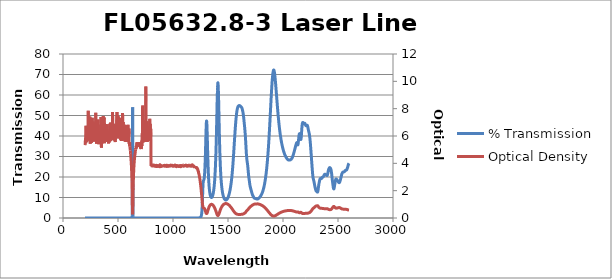
| Category | % Transmission |
|---|---|
| 2600.0 | 26.689 |
| 2599.0 | 26.612 |
| 2598.0 | 26.524 |
| 2597.0 | 26.418 |
| 2596.0 | 26.304 |
| 2595.0 | 26.165 |
| 2594.0 | 25.991 |
| 2593.0 | 25.808 |
| 2592.0 | 25.629 |
| 2591.0 | 25.441 |
| 2590.0 | 25.235 |
| 2589.0 | 25.05 |
| 2588.0 | 24.855 |
| 2587.0 | 24.661 |
| 2586.0 | 24.477 |
| 2585.0 | 24.311 |
| 2584.0 | 24.159 |
| 2583.0 | 23.998 |
| 2582.0 | 23.843 |
| 2581.0 | 23.726 |
| 2580.0 | 23.617 |
| 2579.0 | 23.527 |
| 2578.0 | 23.459 |
| 2577.0 | 23.416 |
| 2576.0 | 23.38 |
| 2575.0 | 23.348 |
| 2574.0 | 23.296 |
| 2573.0 | 23.271 |
| 2572.0 | 23.255 |
| 2571.0 | 23.254 |
| 2570.0 | 23.259 |
| 2569.0 | 23.235 |
| 2568.0 | 23.223 |
| 2567.0 | 23.191 |
| 2566.0 | 23.17 |
| 2565.0 | 23.111 |
| 2564.0 | 23.045 |
| 2563.0 | 22.974 |
| 2562.0 | 22.889 |
| 2561.0 | 22.814 |
| 2560.0 | 22.727 |
| 2559.0 | 22.667 |
| 2558.0 | 22.609 |
| 2557.0 | 22.586 |
| 2556.0 | 22.549 |
| 2555.0 | 22.52 |
| 2554.0 | 22.498 |
| 2553.0 | 22.481 |
| 2552.0 | 22.47 |
| 2551.0 | 22.461 |
| 2550.0 | 22.449 |
| 2549.0 | 22.442 |
| 2548.0 | 22.438 |
| 2547.0 | 22.428 |
| 2546.0 | 22.409 |
| 2545.0 | 22.375 |
| 2544.0 | 22.334 |
| 2543.0 | 22.283 |
| 2542.0 | 22.226 |
| 2541.0 | 22.155 |
| 2540.0 | 22.075 |
| 2539.0 | 21.981 |
| 2538.0 | 21.888 |
| 2537.0 | 21.786 |
| 2536.0 | 21.66 |
| 2535.0 | 21.495 |
| 2534.0 | 21.317 |
| 2533.0 | 21.124 |
| 2532.0 | 20.919 |
| 2531.0 | 20.692 |
| 2530.0 | 20.467 |
| 2529.0 | 20.252 |
| 2528.0 | 20.02 |
| 2527.0 | 19.792 |
| 2526.0 | 19.571 |
| 2525.0 | 19.357 |
| 2524.0 | 19.125 |
| 2523.0 | 18.915 |
| 2522.0 | 18.689 |
| 2521.0 | 18.482 |
| 2520.0 | 18.278 |
| 2519.0 | 18.102 |
| 2518.0 | 17.925 |
| 2517.0 | 17.76 |
| 2516.0 | 17.616 |
| 2515.0 | 17.484 |
| 2514.0 | 17.392 |
| 2513.0 | 17.318 |
| 2512.0 | 17.275 |
| 2511.0 | 17.241 |
| 2510.0 | 17.242 |
| 2509.0 | 17.252 |
| 2508.0 | 17.288 |
| 2507.0 | 17.334 |
| 2506.0 | 17.395 |
| 2505.0 | 17.474 |
| 2504.0 | 17.561 |
| 2503.0 | 17.663 |
| 2502.0 | 17.76 |
| 2501.0 | 17.873 |
| 2500.0 | 17.96 |
| 2499.0 | 18.062 |
| 2498.0 | 18.139 |
| 2497.0 | 18.224 |
| 2496.0 | 18.297 |
| 2495.0 | 18.374 |
| 2494.0 | 18.432 |
| 2493.0 | 18.486 |
| 2492.0 | 18.547 |
| 2491.0 | 18.597 |
| 2490.0 | 18.662 |
| 2489.0 | 18.718 |
| 2488.0 | 18.791 |
| 2487.0 | 18.851 |
| 2486.0 | 18.926 |
| 2485.0 | 18.975 |
| 2484.0 | 19.024 |
| 2483.0 | 19.044 |
| 2482.0 | 19.042 |
| 2481.0 | 18.993 |
| 2480.0 | 18.91 |
| 2479.0 | 18.776 |
| 2478.0 | 18.607 |
| 2477.0 | 18.394 |
| 2476.0 | 18.148 |
| 2475.0 | 17.882 |
| 2474.0 | 17.59 |
| 2473.0 | 17.288 |
| 2472.0 | 16.957 |
| 2471.0 | 16.627 |
| 2470.0 | 16.267 |
| 2469.0 | 15.92 |
| 2468.0 | 15.574 |
| 2467.0 | 15.243 |
| 2466.0 | 14.93 |
| 2465.0 | 14.652 |
| 2464.0 | 14.428 |
| 2463.0 | 14.269 |
| 2462.0 | 14.195 |
| 2461.0 | 14.208 |
| 2460.0 | 14.311 |
| 2459.0 | 14.488 |
| 2458.0 | 14.741 |
| 2457.0 | 15.05 |
| 2456.0 | 15.4 |
| 2455.0 | 15.766 |
| 2454.0 | 16.147 |
| 2453.0 | 16.547 |
| 2452.0 | 16.945 |
| 2451.0 | 17.375 |
| 2450.0 | 17.826 |
| 2449.0 | 18.268 |
| 2448.0 | 18.732 |
| 2447.0 | 19.216 |
| 2446.0 | 19.713 |
| 2445.0 | 20.203 |
| 2444.0 | 20.714 |
| 2443.0 | 21.203 |
| 2442.0 | 21.64 |
| 2441.0 | 22.072 |
| 2440.0 | 22.454 |
| 2439.0 | 22.802 |
| 2438.0 | 23.108 |
| 2437.0 | 23.381 |
| 2436.0 | 23.611 |
| 2435.0 | 23.8 |
| 2434.0 | 23.975 |
| 2433.0 | 24.113 |
| 2432.0 | 24.231 |
| 2431.0 | 24.331 |
| 2430.0 | 24.413 |
| 2429.0 | 24.476 |
| 2428.0 | 24.527 |
| 2427.0 | 24.563 |
| 2426.0 | 24.585 |
| 2425.0 | 24.582 |
| 2424.0 | 24.566 |
| 2423.0 | 24.529 |
| 2422.0 | 24.474 |
| 2421.0 | 24.41 |
| 2420.0 | 24.323 |
| 2419.0 | 24.226 |
| 2418.0 | 24.111 |
| 2417.0 | 23.972 |
| 2416.0 | 23.835 |
| 2415.0 | 23.666 |
| 2414.0 | 23.476 |
| 2413.0 | 23.277 |
| 2412.0 | 23.035 |
| 2411.0 | 22.781 |
| 2410.0 | 22.516 |
| 2409.0 | 22.24 |
| 2408.0 | 21.96 |
| 2407.0 | 21.694 |
| 2406.0 | 21.439 |
| 2405.0 | 21.211 |
| 2404.0 | 21.021 |
| 2403.0 | 20.878 |
| 2402.0 | 20.781 |
| 2401.0 | 20.718 |
| 2400.0 | 20.701 |
| 2399.0 | 20.705 |
| 2398.0 | 20.735 |
| 2397.0 | 20.776 |
| 2396.0 | 20.819 |
| 2395.0 | 20.872 |
| 2394.0 | 20.915 |
| 2393.0 | 20.951 |
| 2392.0 | 20.995 |
| 2391.0 | 21.024 |
| 2390.0 | 21.057 |
| 2389.0 | 21.092 |
| 2388.0 | 21.13 |
| 2387.0 | 21.171 |
| 2386.0 | 21.217 |
| 2385.0 | 21.248 |
| 2384.0 | 21.293 |
| 2383.0 | 21.319 |
| 2382.0 | 21.349 |
| 2381.0 | 21.355 |
| 2380.0 | 21.351 |
| 2379.0 | 21.317 |
| 2378.0 | 21.268 |
| 2377.0 | 21.196 |
| 2376.0 | 21.117 |
| 2375.0 | 21.007 |
| 2374.0 | 20.918 |
| 2373.0 | 20.798 |
| 2372.0 | 20.691 |
| 2371.0 | 20.58 |
| 2370.0 | 20.48 |
| 2369.0 | 20.378 |
| 2368.0 | 20.287 |
| 2367.0 | 20.188 |
| 2366.0 | 20.118 |
| 2365.0 | 20.04 |
| 2364.0 | 20.009 |
| 2363.0 | 19.97 |
| 2362.0 | 19.967 |
| 2361.0 | 19.957 |
| 2360.0 | 19.955 |
| 2359.0 | 19.932 |
| 2358.0 | 19.908 |
| 2357.0 | 19.846 |
| 2356.0 | 19.778 |
| 2355.0 | 19.688 |
| 2354.0 | 19.586 |
| 2353.0 | 19.489 |
| 2352.0 | 19.394 |
| 2351.0 | 19.334 |
| 2350.0 | 19.295 |
| 2349.0 | 19.29 |
| 2348.0 | 19.293 |
| 2347.0 | 19.315 |
| 2346.0 | 19.325 |
| 2345.0 | 19.359 |
| 2344.0 | 19.367 |
| 2343.0 | 19.381 |
| 2342.0 | 19.357 |
| 2341.0 | 19.339 |
| 2340.0 | 19.283 |
| 2339.0 | 19.227 |
| 2338.0 | 19.124 |
| 2337.0 | 19.01 |
| 2336.0 | 18.864 |
| 2335.0 | 18.702 |
| 2334.0 | 18.505 |
| 2333.0 | 18.298 |
| 2332.0 | 18.076 |
| 2331.0 | 17.837 |
| 2330.0 | 17.592 |
| 2329.0 | 17.333 |
| 2328.0 | 17.053 |
| 2327.0 | 16.741 |
| 2326.0 | 16.45 |
| 2325.0 | 16.105 |
| 2324.0 | 15.762 |
| 2323.0 | 15.368 |
| 2322.0 | 14.958 |
| 2321.0 | 14.519 |
| 2320.0 | 14.101 |
| 2319.0 | 13.713 |
| 2318.0 | 13.365 |
| 2317.0 | 13.077 |
| 2316.0 | 12.862 |
| 2315.0 | 12.714 |
| 2314.0 | 12.634 |
| 2313.0 | 12.607 |
| 2312.0 | 12.631 |
| 2311.0 | 12.678 |
| 2310.0 | 12.744 |
| 2309.0 | 12.818 |
| 2308.0 | 12.885 |
| 2307.0 | 12.949 |
| 2306.0 | 12.997 |
| 2305.0 | 13.039 |
| 2304.0 | 13.081 |
| 2303.0 | 13.121 |
| 2302.0 | 13.192 |
| 2301.0 | 13.273 |
| 2300.0 | 13.381 |
| 2299.0 | 13.507 |
| 2298.0 | 13.664 |
| 2297.0 | 13.825 |
| 2296.0 | 14.027 |
| 2295.0 | 14.226 |
| 2294.0 | 14.447 |
| 2293.0 | 14.665 |
| 2292.0 | 14.903 |
| 2291.0 | 15.143 |
| 2290.0 | 15.396 |
| 2289.0 | 15.668 |
| 2288.0 | 15.939 |
| 2287.0 | 16.228 |
| 2286.0 | 16.516 |
| 2285.0 | 16.816 |
| 2284.0 | 17.106 |
| 2283.0 | 17.406 |
| 2282.0 | 17.686 |
| 2281.0 | 17.933 |
| 2280.0 | 18.166 |
| 2279.0 | 18.379 |
| 2278.0 | 18.581 |
| 2277.0 | 18.768 |
| 2276.0 | 18.977 |
| 2275.0 | 19.209 |
| 2274.0 | 19.471 |
| 2273.0 | 19.791 |
| 2272.0 | 20.175 |
| 2271.0 | 20.633 |
| 2270.0 | 21.166 |
| 2269.0 | 21.765 |
| 2268.0 | 22.394 |
| 2267.0 | 23.07 |
| 2266.0 | 23.751 |
| 2265.0 | 24.455 |
| 2264.0 | 25.186 |
| 2263.0 | 25.944 |
| 2262.0 | 26.679 |
| 2261.0 | 27.412 |
| 2260.0 | 28.153 |
| 2259.0 | 28.904 |
| 2258.0 | 29.638 |
| 2257.0 | 30.415 |
| 2256.0 | 31.197 |
| 2255.0 | 31.933 |
| 2254.0 | 32.699 |
| 2253.0 | 33.446 |
| 2252.0 | 34.177 |
| 2251.0 | 34.894 |
| 2250.0 | 35.6 |
| 2249.0 | 36.267 |
| 2248.0 | 36.895 |
| 2247.0 | 37.49 |
| 2246.0 | 38.047 |
| 2245.0 | 38.58 |
| 2244.0 | 39.095 |
| 2243.0 | 39.532 |
| 2242.0 | 39.943 |
| 2241.0 | 40.328 |
| 2240.0 | 40.674 |
| 2239.0 | 40.974 |
| 2238.0 | 41.264 |
| 2237.0 | 41.548 |
| 2236.0 | 41.769 |
| 2235.0 | 42.004 |
| 2234.0 | 42.229 |
| 2233.0 | 42.45 |
| 2232.0 | 42.689 |
| 2231.0 | 42.933 |
| 2230.0 | 43.223 |
| 2229.0 | 43.461 |
| 2228.0 | 43.74 |
| 2227.0 | 44.003 |
| 2226.0 | 44.263 |
| 2225.0 | 44.516 |
| 2224.0 | 44.706 |
| 2223.0 | 44.926 |
| 2222.0 | 45.059 |
| 2221.0 | 45.169 |
| 2220.0 | 45.241 |
| 2219.0 | 45.272 |
| 2218.0 | 45.305 |
| 2217.0 | 45.247 |
| 2216.0 | 45.238 |
| 2215.0 | 45.181 |
| 2214.0 | 45.111 |
| 2213.0 | 45.07 |
| 2212.0 | 45 |
| 2211.0 | 45.01 |
| 2210.0 | 44.975 |
| 2209.0 | 45.017 |
| 2208.0 | 45.088 |
| 2207.0 | 45.142 |
| 2206.0 | 45.268 |
| 2205.0 | 45.358 |
| 2204.0 | 45.508 |
| 2203.0 | 45.635 |
| 2202.0 | 45.759 |
| 2201.0 | 45.928 |
| 2200.0 | 46.005 |
| 2199.0 | 46.117 |
| 2198.0 | 46.171 |
| 2197.0 | 46.196 |
| 2196.0 | 46.221 |
| 2195.0 | 46.168 |
| 2194.0 | 46.164 |
| 2193.0 | 46.082 |
| 2192.0 | 46.009 |
| 2191.0 | 45.978 |
| 2190.0 | 45.909 |
| 2189.0 | 45.939 |
| 2188.0 | 45.941 |
| 2187.0 | 46.014 |
| 2186.0 | 46.132 |
| 2185.0 | 46.209 |
| 2184.0 | 46.359 |
| 2183.0 | 46.444 |
| 2182.0 | 46.52 |
| 2181.0 | 46.582 |
| 2180.0 | 46.565 |
| 2179.0 | 46.554 |
| 2178.0 | 46.43 |
| 2177.0 | 46.267 |
| 2176.0 | 46.049 |
| 2175.0 | 45.719 |
| 2174.0 | 45.33 |
| 2173.0 | 44.823 |
| 2172.0 | 44.233 |
| 2171.0 | 43.549 |
| 2170.0 | 42.773 |
| 2169.0 | 41.954 |
| 2168.0 | 41.136 |
| 2167.0 | 40.31 |
| 2166.0 | 39.59 |
| 2165.0 | 39.016 |
| 2164.0 | 38.596 |
| 2163.0 | 38.352 |
| 2162.0 | 38.269 |
| 2161.0 | 38.362 |
| 2160.0 | 38.564 |
| 2159.0 | 38.874 |
| 2158.0 | 39.233 |
| 2157.0 | 39.61 |
| 2156.0 | 40.006 |
| 2155.0 | 40.351 |
| 2154.0 | 40.661 |
| 2153.0 | 40.904 |
| 2152.0 | 41.054 |
| 2151.0 | 41.145 |
| 2150.0 | 41.142 |
| 2149.0 | 41.055 |
| 2148.0 | 40.905 |
| 2147.0 | 40.65 |
| 2146.0 | 40.34 |
| 2145.0 | 39.966 |
| 2144.0 | 39.52 |
| 2143.0 | 39.035 |
| 2142.0 | 38.523 |
| 2141.0 | 37.955 |
| 2140.0 | 37.422 |
| 2139.0 | 36.916 |
| 2138.0 | 36.462 |
| 2137.0 | 36.096 |
| 2136.0 | 35.821 |
| 2135.0 | 35.68 |
| 2134.0 | 35.652 |
| 2133.0 | 35.723 |
| 2132.0 | 35.886 |
| 2131.0 | 36.085 |
| 2130.0 | 36.295 |
| 2129.0 | 36.503 |
| 2128.0 | 36.649 |
| 2127.0 | 36.747 |
| 2126.0 | 36.778 |
| 2125.0 | 36.731 |
| 2124.0 | 36.652 |
| 2123.0 | 36.528 |
| 2122.0 | 36.371 |
| 2121.0 | 36.219 |
| 2120.0 | 36.047 |
| 2119.0 | 35.875 |
| 2118.0 | 35.71 |
| 2117.0 | 35.514 |
| 2116.0 | 35.344 |
| 2115.0 | 35.153 |
| 2114.0 | 34.941 |
| 2113.0 | 34.757 |
| 2112.0 | 34.538 |
| 2111.0 | 34.309 |
| 2110.0 | 34.112 |
| 2109.0 | 33.887 |
| 2108.0 | 33.675 |
| 2107.0 | 33.476 |
| 2106.0 | 33.266 |
| 2105.0 | 33.055 |
| 2104.0 | 32.857 |
| 2103.0 | 32.641 |
| 2102.0 | 32.441 |
| 2101.0 | 32.246 |
| 2100.0 | 32.042 |
| 2099.0 | 31.854 |
| 2098.0 | 31.656 |
| 2097.0 | 31.461 |
| 2096.0 | 31.277 |
| 2095.0 | 31.09 |
| 2094.0 | 30.912 |
| 2093.0 | 30.747 |
| 2092.0 | 30.569 |
| 2091.0 | 30.395 |
| 2090.0 | 30.245 |
| 2089.0 | 30.08 |
| 2088.0 | 29.929 |
| 2087.0 | 29.805 |
| 2086.0 | 29.664 |
| 2085.0 | 29.541 |
| 2084.0 | 29.428 |
| 2083.0 | 29.312 |
| 2082.0 | 29.217 |
| 2081.0 | 29.136 |
| 2080.0 | 29.05 |
| 2079.0 | 28.97 |
| 2078.0 | 28.902 |
| 2077.0 | 28.826 |
| 2076.0 | 28.759 |
| 2075.0 | 28.719 |
| 2074.0 | 28.66 |
| 2073.0 | 28.608 |
| 2072.0 | 28.561 |
| 2071.0 | 28.511 |
| 2070.0 | 28.469 |
| 2069.0 | 28.434 |
| 2068.0 | 28.401 |
| 2067.0 | 28.374 |
| 2066.0 | 28.35 |
| 2065.0 | 28.318 |
| 2064.0 | 28.301 |
| 2063.0 | 28.293 |
| 2062.0 | 28.275 |
| 2061.0 | 28.27 |
| 2060.0 | 28.273 |
| 2059.0 | 28.256 |
| 2058.0 | 28.25 |
| 2057.0 | 28.259 |
| 2056.0 | 28.256 |
| 2055.0 | 28.257 |
| 2054.0 | 28.266 |
| 2053.0 | 28.265 |
| 2052.0 | 28.27 |
| 2051.0 | 28.286 |
| 2050.0 | 28.296 |
| 2049.0 | 28.314 |
| 2048.0 | 28.343 |
| 2047.0 | 28.362 |
| 2046.0 | 28.385 |
| 2045.0 | 28.425 |
| 2044.0 | 28.467 |
| 2043.0 | 28.51 |
| 2042.0 | 28.566 |
| 2041.0 | 28.629 |
| 2040.0 | 28.674 |
| 2039.0 | 28.737 |
| 2038.0 | 28.818 |
| 2037.0 | 28.889 |
| 2036.0 | 28.961 |
| 2035.0 | 29.041 |
| 2034.0 | 29.115 |
| 2033.0 | 29.192 |
| 2032.0 | 29.277 |
| 2031.0 | 29.367 |
| 2030.0 | 29.443 |
| 2029.0 | 29.537 |
| 2028.0 | 29.625 |
| 2027.0 | 29.712 |
| 2026.0 | 29.815 |
| 2025.0 | 29.926 |
| 2024.0 | 30.033 |
| 2023.0 | 30.132 |
| 2022.0 | 30.253 |
| 2021.0 | 30.361 |
| 2020.0 | 30.474 |
| 2019.0 | 30.604 |
| 2018.0 | 30.738 |
| 2017.0 | 30.85 |
| 2016.0 | 30.97 |
| 2015.0 | 31.111 |
| 2014.0 | 31.234 |
| 2013.0 | 31.371 |
| 2012.0 | 31.524 |
| 2011.0 | 31.67 |
| 2010.0 | 31.81 |
| 2009.0 | 31.971 |
| 2008.0 | 32.142 |
| 2007.0 | 32.302 |
| 2006.0 | 32.489 |
| 2005.0 | 32.687 |
| 2004.0 | 32.868 |
| 2003.0 | 33.05 |
| 2002.0 | 33.253 |
| 2001.0 | 33.46 |
| 2000.0 | 33.67 |
| 1999.0 | 33.87 |
| 1998.0 | 34.088 |
| 1997.0 | 34.295 |
| 1996.0 | 34.513 |
| 1995.0 | 34.739 |
| 1994.0 | 34.979 |
| 1993.0 | 35.221 |
| 1992.0 | 35.459 |
| 1991.0 | 35.722 |
| 1990.0 | 35.984 |
| 1989.0 | 36.246 |
| 1988.0 | 36.521 |
| 1987.0 | 36.827 |
| 1986.0 | 37.12 |
| 1985.0 | 37.397 |
| 1984.0 | 37.707 |
| 1983.0 | 38.032 |
| 1982.0 | 38.339 |
| 1981.0 | 38.663 |
| 1980.0 | 39 |
| 1979.0 | 39.344 |
| 1978.0 | 39.671 |
| 1977.0 | 40.04 |
| 1976.0 | 40.403 |
| 1975.0 | 40.768 |
| 1974.0 | 41.151 |
| 1973.0 | 41.55 |
| 1972.0 | 41.958 |
| 1971.0 | 42.372 |
| 1970.0 | 42.8 |
| 1969.0 | 43.245 |
| 1968.0 | 43.718 |
| 1967.0 | 44.188 |
| 1966.0 | 44.656 |
| 1965.0 | 45.166 |
| 1964.0 | 45.678 |
| 1963.0 | 46.184 |
| 1962.0 | 46.694 |
| 1961.0 | 47.256 |
| 1960.0 | 47.817 |
| 1959.0 | 48.354 |
| 1958.0 | 48.921 |
| 1957.0 | 49.495 |
| 1956.0 | 50.078 |
| 1955.0 | 50.685 |
| 1954.0 | 51.305 |
| 1953.0 | 51.936 |
| 1952.0 | 52.568 |
| 1951.0 | 53.2 |
| 1950.0 | 53.835 |
| 1949.0 | 54.506 |
| 1948.0 | 55.21 |
| 1947.0 | 55.878 |
| 1946.0 | 56.542 |
| 1945.0 | 57.228 |
| 1944.0 | 57.931 |
| 1943.0 | 58.591 |
| 1942.0 | 59.291 |
| 1941.0 | 59.99 |
| 1940.0 | 60.666 |
| 1939.0 | 61.351 |
| 1938.0 | 62.029 |
| 1937.0 | 62.726 |
| 1936.0 | 63.426 |
| 1935.0 | 64.111 |
| 1934.0 | 64.776 |
| 1933.0 | 65.412 |
| 1932.0 | 66.076 |
| 1931.0 | 66.68 |
| 1930.0 | 67.26 |
| 1929.0 | 67.836 |
| 1928.0 | 68.424 |
| 1927.0 | 68.957 |
| 1926.0 | 69.449 |
| 1925.0 | 69.908 |
| 1924.0 | 70.361 |
| 1923.0 | 70.756 |
| 1922.0 | 71.072 |
| 1921.0 | 71.332 |
| 1920.0 | 71.613 |
| 1919.0 | 71.861 |
| 1918.0 | 72.042 |
| 1917.0 | 72.132 |
| 1916.0 | 72.192 |
| 1915.0 | 72.189 |
| 1914.0 | 72.146 |
| 1913.0 | 71.999 |
| 1912.0 | 71.799 |
| 1911.0 | 71.544 |
| 1910.0 | 71.251 |
| 1909.0 | 70.927 |
| 1908.0 | 70.565 |
| 1907.0 | 70.129 |
| 1906.0 | 69.576 |
| 1905.0 | 68.997 |
| 1904.0 | 68.362 |
| 1903.0 | 67.721 |
| 1902.0 | 67.104 |
| 1901.0 | 66.42 |
| 1900.0 | 65.659 |
| 1899.0 | 64.796 |
| 1898.0 | 63.886 |
| 1897.0 | 62.987 |
| 1896.0 | 62.144 |
| 1895.0 | 61.308 |
| 1894.0 | 60.396 |
| 1893.0 | 59.398 |
| 1892.0 | 58.422 |
| 1891.0 | 57.382 |
| 1890.0 | 56.298 |
| 1889.0 | 55.239 |
| 1888.0 | 54.245 |
| 1887.0 | 53.233 |
| 1886.0 | 52.228 |
| 1885.0 | 51.166 |
| 1884.0 | 50.034 |
| 1883.0 | 48.954 |
| 1882.0 | 47.929 |
| 1881.0 | 46.938 |
| 1880.0 | 45.901 |
| 1879.0 | 44.966 |
| 1878.0 | 43.976 |
| 1877.0 | 42.953 |
| 1876.0 | 41.967 |
| 1875.0 | 41.063 |
| 1874.0 | 40.145 |
| 1873.0 | 39.26 |
| 1872.0 | 38.299 |
| 1871.0 | 37.32 |
| 1870.0 | 36.48 |
| 1869.0 | 35.677 |
| 1868.0 | 34.814 |
| 1867.0 | 33.998 |
| 1866.0 | 33.242 |
| 1865.0 | 32.515 |
| 1864.0 | 31.791 |
| 1863.0 | 31.066 |
| 1862.0 | 30.417 |
| 1861.0 | 29.77 |
| 1860.0 | 29.069 |
| 1859.0 | 28.36 |
| 1858.0 | 27.72 |
| 1857.0 | 27.133 |
| 1856.0 | 26.556 |
| 1855.0 | 25.983 |
| 1854.0 | 25.416 |
| 1853.0 | 24.847 |
| 1852.0 | 24.274 |
| 1851.0 | 23.775 |
| 1850.0 | 23.347 |
| 1849.0 | 22.887 |
| 1848.0 | 22.401 |
| 1847.0 | 21.872 |
| 1846.0 | 21.369 |
| 1845.0 | 20.97 |
| 1844.0 | 20.62 |
| 1843.0 | 20.266 |
| 1842.0 | 19.864 |
| 1841.0 | 19.452 |
| 1840.0 | 19.065 |
| 1839.0 | 18.713 |
| 1838.0 | 18.388 |
| 1837.0 | 18.052 |
| 1836.0 | 17.709 |
| 1835.0 | 17.373 |
| 1834.0 | 17.079 |
| 1833.0 | 16.798 |
| 1832.0 | 16.517 |
| 1831.0 | 16.24 |
| 1830.0 | 15.956 |
| 1829.0 | 15.684 |
| 1828.0 | 15.451 |
| 1827.0 | 15.213 |
| 1826.0 | 14.964 |
| 1825.0 | 14.728 |
| 1824.0 | 14.522 |
| 1823.0 | 14.337 |
| 1822.0 | 14.138 |
| 1821.0 | 13.937 |
| 1820.0 | 13.721 |
| 1819.0 | 13.534 |
| 1818.0 | 13.363 |
| 1817.0 | 13.208 |
| 1816.0 | 13.038 |
| 1815.0 | 12.868 |
| 1814.0 | 12.706 |
| 1813.0 | 12.555 |
| 1812.0 | 12.413 |
| 1811.0 | 12.263 |
| 1810.0 | 12.131 |
| 1809.0 | 11.999 |
| 1808.0 | 11.876 |
| 1807.0 | 11.751 |
| 1806.0 | 11.629 |
| 1805.0 | 11.517 |
| 1804.0 | 11.399 |
| 1803.0 | 11.299 |
| 1802.0 | 11.199 |
| 1801.0 | 11.095 |
| 1800.0 | 10.993 |
| 1799.0 | 10.901 |
| 1798.0 | 10.816 |
| 1797.0 | 10.729 |
| 1796.0 | 10.648 |
| 1795.0 | 10.567 |
| 1794.0 | 10.488 |
| 1793.0 | 10.414 |
| 1792.0 | 10.342 |
| 1791.0 | 10.276 |
| 1790.0 | 10.208 |
| 1789.0 | 10.143 |
| 1788.0 | 10.082 |
| 1787.0 | 10.026 |
| 1786.0 | 9.968 |
| 1785.0 | 9.91 |
| 1784.0 | 9.863 |
| 1783.0 | 9.81 |
| 1782.0 | 9.761 |
| 1781.0 | 9.709 |
| 1780.0 | 9.662 |
| 1779.0 | 9.614 |
| 1778.0 | 9.569 |
| 1777.0 | 9.52 |
| 1776.0 | 9.479 |
| 1775.0 | 9.436 |
| 1774.0 | 9.398 |
| 1773.0 | 9.362 |
| 1772.0 | 9.33 |
| 1771.0 | 9.297 |
| 1770.0 | 9.275 |
| 1769.0 | 9.258 |
| 1768.0 | 9.249 |
| 1767.0 | 9.241 |
| 1766.0 | 9.245 |
| 1765.0 | 9.248 |
| 1764.0 | 9.256 |
| 1763.0 | 9.267 |
| 1762.0 | 9.28 |
| 1761.0 | 9.296 |
| 1760.0 | 9.309 |
| 1759.0 | 9.327 |
| 1758.0 | 9.347 |
| 1757.0 | 9.364 |
| 1756.0 | 9.38 |
| 1755.0 | 9.397 |
| 1754.0 | 9.414 |
| 1753.0 | 9.425 |
| 1752.0 | 9.435 |
| 1751.0 | 9.455 |
| 1750.0 | 9.468 |
| 1749.0 | 9.485 |
| 1748.0 | 9.508 |
| 1747.0 | 9.524 |
| 1746.0 | 9.543 |
| 1745.0 | 9.559 |
| 1744.0 | 9.58 |
| 1743.0 | 9.601 |
| 1742.0 | 9.623 |
| 1741.0 | 9.656 |
| 1740.0 | 9.693 |
| 1739.0 | 9.735 |
| 1738.0 | 9.79 |
| 1737.0 | 9.853 |
| 1736.0 | 9.918 |
| 1735.0 | 9.994 |
| 1734.0 | 10.076 |
| 1733.0 | 10.169 |
| 1732.0 | 10.26 |
| 1731.0 | 10.359 |
| 1730.0 | 10.474 |
| 1729.0 | 10.581 |
| 1728.0 | 10.689 |
| 1727.0 | 10.802 |
| 1726.0 | 10.907 |
| 1725.0 | 11.015 |
| 1724.0 | 11.137 |
| 1723.0 | 11.269 |
| 1722.0 | 11.398 |
| 1721.0 | 11.547 |
| 1720.0 | 11.709 |
| 1719.0 | 11.883 |
| 1718.0 | 12.065 |
| 1717.0 | 12.263 |
| 1716.0 | 12.461 |
| 1715.0 | 12.658 |
| 1714.0 | 12.862 |
| 1713.0 | 13.061 |
| 1712.0 | 13.25 |
| 1711.0 | 13.452 |
| 1710.0 | 13.649 |
| 1709.0 | 13.836 |
| 1708.0 | 14.026 |
| 1707.0 | 14.224 |
| 1706.0 | 14.419 |
| 1705.0 | 14.629 |
| 1704.0 | 14.848 |
| 1703.0 | 15.064 |
| 1702.0 | 15.291 |
| 1701.0 | 15.537 |
| 1700.0 | 15.82 |
| 1699.0 | 16.132 |
| 1698.0 | 16.502 |
| 1697.0 | 16.902 |
| 1696.0 | 17.292 |
| 1695.0 | 17.698 |
| 1694.0 | 18.101 |
| 1693.0 | 18.478 |
| 1692.0 | 18.854 |
| 1691.0 | 19.224 |
| 1690.0 | 19.602 |
| 1689.0 | 20.003 |
| 1688.0 | 20.463 |
| 1687.0 | 20.963 |
| 1686.0 | 21.525 |
| 1685.0 | 22.132 |
| 1684.0 | 22.744 |
| 1683.0 | 23.358 |
| 1682.0 | 23.952 |
| 1681.0 | 24.545 |
| 1680.0 | 25.071 |
| 1679.0 | 25.586 |
| 1678.0 | 26.039 |
| 1677.0 | 26.442 |
| 1676.0 | 26.836 |
| 1675.0 | 27.196 |
| 1674.0 | 27.57 |
| 1673.0 | 27.957 |
| 1672.0 | 28.379 |
| 1671.0 | 28.845 |
| 1670.0 | 29.347 |
| 1669.0 | 29.947 |
| 1668.0 | 30.63 |
| 1667.0 | 31.422 |
| 1666.0 | 32.316 |
| 1665.0 | 33.256 |
| 1664.0 | 34.219 |
| 1663.0 | 35.198 |
| 1662.0 | 36.175 |
| 1661.0 | 37.104 |
| 1660.0 | 38.043 |
| 1659.0 | 38.937 |
| 1658.0 | 39.744 |
| 1657.0 | 40.532 |
| 1656.0 | 41.275 |
| 1655.0 | 41.981 |
| 1654.0 | 42.664 |
| 1653.0 | 43.303 |
| 1652.0 | 43.912 |
| 1651.0 | 44.463 |
| 1650.0 | 45 |
| 1649.0 | 45.529 |
| 1648.0 | 46.044 |
| 1647.0 | 46.603 |
| 1646.0 | 47.149 |
| 1645.0 | 47.694 |
| 1644.0 | 48.238 |
| 1643.0 | 48.771 |
| 1642.0 | 49.279 |
| 1641.0 | 49.747 |
| 1640.0 | 50.189 |
| 1639.0 | 50.556 |
| 1638.0 | 50.915 |
| 1637.0 | 51.233 |
| 1636.0 | 51.522 |
| 1635.0 | 51.803 |
| 1634.0 | 52.076 |
| 1633.0 | 52.332 |
| 1632.0 | 52.561 |
| 1631.0 | 52.798 |
| 1630.0 | 53.015 |
| 1629.0 | 53.206 |
| 1628.0 | 53.388 |
| 1627.0 | 53.541 |
| 1626.0 | 53.694 |
| 1625.0 | 53.813 |
| 1624.0 | 53.899 |
| 1623.0 | 53.986 |
| 1622.0 | 54.053 |
| 1621.0 | 54.12 |
| 1620.0 | 54.156 |
| 1619.0 | 54.224 |
| 1618.0 | 54.28 |
| 1617.0 | 54.339 |
| 1616.0 | 54.41 |
| 1615.0 | 54.464 |
| 1614.0 | 54.542 |
| 1613.0 | 54.594 |
| 1612.0 | 54.644 |
| 1611.0 | 54.68 |
| 1610.0 | 54.728 |
| 1609.0 | 54.748 |
| 1608.0 | 54.76 |
| 1607.0 | 54.794 |
| 1606.0 | 54.799 |
| 1605.0 | 54.817 |
| 1604.0 | 54.822 |
| 1603.0 | 54.83 |
| 1602.0 | 54.841 |
| 1601.0 | 54.836 |
| 1600.0 | 54.835 |
| 1599.0 | 54.808 |
| 1598.0 | 54.805 |
| 1597.0 | 54.764 |
| 1596.0 | 54.715 |
| 1595.0 | 54.662 |
| 1594.0 | 54.595 |
| 1593.0 | 54.519 |
| 1592.0 | 54.432 |
| 1591.0 | 54.335 |
| 1590.0 | 54.2 |
| 1589.0 | 54.069 |
| 1588.0 | 53.901 |
| 1587.0 | 53.723 |
| 1586.0 | 53.521 |
| 1585.0 | 53.288 |
| 1584.0 | 53.036 |
| 1583.0 | 52.75 |
| 1582.0 | 52.441 |
| 1581.0 | 52.11 |
| 1580.0 | 51.76 |
| 1579.0 | 51.371 |
| 1578.0 | 50.964 |
| 1577.0 | 50.504 |
| 1576.0 | 50.008 |
| 1575.0 | 49.508 |
| 1574.0 | 48.962 |
| 1573.0 | 48.392 |
| 1572.0 | 47.794 |
| 1571.0 | 47.175 |
| 1570.0 | 46.492 |
| 1569.0 | 45.823 |
| 1568.0 | 45.136 |
| 1567.0 | 44.411 |
| 1566.0 | 43.659 |
| 1565.0 | 42.903 |
| 1564.0 | 42.091 |
| 1563.0 | 41.274 |
| 1562.0 | 40.461 |
| 1561.0 | 39.642 |
| 1560.0 | 38.8 |
| 1559.0 | 37.959 |
| 1558.0 | 37.1 |
| 1557.0 | 36.212 |
| 1556.0 | 35.369 |
| 1555.0 | 34.493 |
| 1554.0 | 33.643 |
| 1553.0 | 32.782 |
| 1552.0 | 31.949 |
| 1551.0 | 31.081 |
| 1550.0 | 30.235 |
| 1549.0 | 29.453 |
| 1548.0 | 28.644 |
| 1547.0 | 27.864 |
| 1546.0 | 27.116 |
| 1545.0 | 26.354 |
| 1544.0 | 25.624 |
| 1543.0 | 24.924 |
| 1542.0 | 24.257 |
| 1541.0 | 23.594 |
| 1540.0 | 22.966 |
| 1539.0 | 22.345 |
| 1538.0 | 21.731 |
| 1537.0 | 21.158 |
| 1536.0 | 20.605 |
| 1535.0 | 20.081 |
| 1534.0 | 19.557 |
| 1533.0 | 19.081 |
| 1532.0 | 18.591 |
| 1531.0 | 18.126 |
| 1530.0 | 17.699 |
| 1529.0 | 17.279 |
| 1528.0 | 16.872 |
| 1527.0 | 16.48 |
| 1526.0 | 16.094 |
| 1525.0 | 15.715 |
| 1524.0 | 15.357 |
| 1523.0 | 15.026 |
| 1522.0 | 14.691 |
| 1521.0 | 14.376 |
| 1520.0 | 14.072 |
| 1519.0 | 13.774 |
| 1518.0 | 13.491 |
| 1517.0 | 13.226 |
| 1516.0 | 12.964 |
| 1515.0 | 12.713 |
| 1514.0 | 12.475 |
| 1513.0 | 12.232 |
| 1512.0 | 12.006 |
| 1511.0 | 11.802 |
| 1510.0 | 11.591 |
| 1509.0 | 11.397 |
| 1508.0 | 11.21 |
| 1507.0 | 11.03 |
| 1506.0 | 10.853 |
| 1505.0 | 10.688 |
| 1504.0 | 10.538 |
| 1503.0 | 10.385 |
| 1502.0 | 10.246 |
| 1501.0 | 10.114 |
| 1500.0 | 9.982 |
| 1499.0 | 9.861 |
| 1498.0 | 9.752 |
| 1497.0 | 9.648 |
| 1496.0 | 9.549 |
| 1495.0 | 9.46 |
| 1494.0 | 9.372 |
| 1493.0 | 9.292 |
| 1492.0 | 9.219 |
| 1491.0 | 9.15 |
| 1490.0 | 9.093 |
| 1489.0 | 9.035 |
| 1488.0 | 8.989 |
| 1487.0 | 8.944 |
| 1486.0 | 8.907 |
| 1485.0 | 8.872 |
| 1484.0 | 8.845 |
| 1483.0 | 8.825 |
| 1482.0 | 8.808 |
| 1481.0 | 8.801 |
| 1480.0 | 8.795 |
| 1479.0 | 8.8 |
| 1478.0 | 8.81 |
| 1477.0 | 8.827 |
| 1476.0 | 8.849 |
| 1475.0 | 8.877 |
| 1474.0 | 8.915 |
| 1473.0 | 8.958 |
| 1472.0 | 9.008 |
| 1471.0 | 9.06 |
| 1470.0 | 9.123 |
| 1469.0 | 9.195 |
| 1468.0 | 9.276 |
| 1467.0 | 9.362 |
| 1466.0 | 9.456 |
| 1465.0 | 9.56 |
| 1464.0 | 9.671 |
| 1463.0 | 9.79 |
| 1462.0 | 9.923 |
| 1461.0 | 10.066 |
| 1460.0 | 10.219 |
| 1459.0 | 10.38 |
| 1458.0 | 10.557 |
| 1457.0 | 10.745 |
| 1456.0 | 10.946 |
| 1455.0 | 11.17 |
| 1454.0 | 11.402 |
| 1453.0 | 11.644 |
| 1452.0 | 11.908 |
| 1451.0 | 12.194 |
| 1450.0 | 12.488 |
| 1449.0 | 12.818 |
| 1448.0 | 13.169 |
| 1447.0 | 13.523 |
| 1446.0 | 13.917 |
| 1445.0 | 14.345 |
| 1444.0 | 14.782 |
| 1443.0 | 15.258 |
| 1442.0 | 15.781 |
| 1441.0 | 16.344 |
| 1440.0 | 16.913 |
| 1439.0 | 17.55 |
| 1438.0 | 18.214 |
| 1437.0 | 18.95 |
| 1436.0 | 19.745 |
| 1435.0 | 20.591 |
| 1434.0 | 21.49 |
| 1433.0 | 22.465 |
| 1432.0 | 23.521 |
| 1431.0 | 24.665 |
| 1430.0 | 25.91 |
| 1429.0 | 27.269 |
| 1428.0 | 28.686 |
| 1427.0 | 30.271 |
| 1426.0 | 31.912 |
| 1425.0 | 33.733 |
| 1424.0 | 35.652 |
| 1423.0 | 37.797 |
| 1422.0 | 40.018 |
| 1421.0 | 42.221 |
| 1420.0 | 44.621 |
| 1419.0 | 47.103 |
| 1418.0 | 49.639 |
| 1417.0 | 52.167 |
| 1416.0 | 54.635 |
| 1415.0 | 56.931 |
| 1414.0 | 59.196 |
| 1413.0 | 61.208 |
| 1412.0 | 62.867 |
| 1411.0 | 64.287 |
| 1410.0 | 65.282 |
| 1409.0 | 65.846 |
| 1408.0 | 65.974 |
| 1407.0 | 65.637 |
| 1406.0 | 64.848 |
| 1405.0 | 63.758 |
| 1404.0 | 62.023 |
| 1403.0 | 60.204 |
| 1402.0 | 58.223 |
| 1401.0 | 56.009 |
| 1400.0 | 53.456 |
| 1399.0 | 50.925 |
| 1398.0 | 48.492 |
| 1397.0 | 46.131 |
| 1396.0 | 43.707 |
| 1395.0 | 41.316 |
| 1394.0 | 39.044 |
| 1393.0 | 37.19 |
| 1392.0 | 35.066 |
| 1391.0 | 33.113 |
| 1390.0 | 31.464 |
| 1389.0 | 29.866 |
| 1388.0 | 28.344 |
| 1387.0 | 26.822 |
| 1386.0 | 25.606 |
| 1385.0 | 24.305 |
| 1384.0 | 23.123 |
| 1383.0 | 22.154 |
| 1382.0 | 21.028 |
| 1381.0 | 20.18 |
| 1380.0 | 19.267 |
| 1379.0 | 18.498 |
| 1378.0 | 17.747 |
| 1377.0 | 17.082 |
| 1376.0 | 16.45 |
| 1375.0 | 15.869 |
| 1374.0 | 15.322 |
| 1373.0 | 14.827 |
| 1372.0 | 14.346 |
| 1371.0 | 13.908 |
| 1370.0 | 13.496 |
| 1369.0 | 13.138 |
| 1368.0 | 12.788 |
| 1367.0 | 12.45 |
| 1366.0 | 12.157 |
| 1365.0 | 11.888 |
| 1364.0 | 11.614 |
| 1363.0 | 11.397 |
| 1362.0 | 11.194 |
| 1361.0 | 10.973 |
| 1360.0 | 10.808 |
| 1359.0 | 10.648 |
| 1358.0 | 10.51 |
| 1357.0 | 10.391 |
| 1356.0 | 10.292 |
| 1355.0 | 10.206 |
| 1354.0 | 10.14 |
| 1353.0 | 10.081 |
| 1352.0 | 10.044 |
| 1351.0 | 10.021 |
| 1350.0 | 10.016 |
| 1349.0 | 10.024 |
| 1348.0 | 10.047 |
| 1347.0 | 10.094 |
| 1346.0 | 10.146 |
| 1345.0 | 10.22 |
| 1344.0 | 10.316 |
| 1343.0 | 10.428 |
| 1342.0 | 10.561 |
| 1341.0 | 10.716 |
| 1340.0 | 10.894 |
| 1339.0 | 11.099 |
| 1338.0 | 11.322 |
| 1337.0 | 11.579 |
| 1336.0 | 11.867 |
| 1335.0 | 12.183 |
| 1334.0 | 12.55 |
| 1333.0 | 12.946 |
| 1332.0 | 13.384 |
| 1331.0 | 13.86 |
| 1330.0 | 14.398 |
| 1329.0 | 14.977 |
| 1328.0 | 15.644 |
| 1327.0 | 16.377 |
| 1326.0 | 17.156 |
| 1325.0 | 18.033 |
| 1324.0 | 18.982 |
| 1323.0 | 20.04 |
| 1322.0 | 21.191 |
| 1321.0 | 22.489 |
| 1320.0 | 23.896 |
| 1319.0 | 25.331 |
| 1318.0 | 26.95 |
| 1317.0 | 28.669 |
| 1316.0 | 30.518 |
| 1315.0 | 32.53 |
| 1314.0 | 34.592 |
| 1313.0 | 36.661 |
| 1312.0 | 38.711 |
| 1311.0 | 40.758 |
| 1310.0 | 42.606 |
| 1309.0 | 44.295 |
| 1308.0 | 45.681 |
| 1307.0 | 46.675 |
| 1306.0 | 47.22 |
| 1305.0 | 47.318 |
| 1304.0 | 46.945 |
| 1303.0 | 46.137 |
| 1302.0 | 44.884 |
| 1301.0 | 43.326 |
| 1300.0 | 41.612 |
| 1299.0 | 39.659 |
| 1298.0 | 37.687 |
| 1297.0 | 35.686 |
| 1296.0 | 33.67 |
| 1295.0 | 31.739 |
| 1294.0 | 29.974 |
| 1293.0 | 28.345 |
| 1292.0 | 26.831 |
| 1291.0 | 25.481 |
| 1290.0 | 24.248 |
| 1289.0 | 23.134 |
| 1288.0 | 22.2 |
| 1287.0 | 21.383 |
| 1286.0 | 20.689 |
| 1285.0 | 20.099 |
| 1284.0 | 19.63 |
| 1283.0 | 19.238 |
| 1282.0 | 18.944 |
| 1281.0 | 18.738 |
| 1280.0 | 18.584 |
| 1279.0 | 18.474 |
| 1278.0 | 18.377 |
| 1277.0 | 18.241 |
| 1276.0 | 18.026 |
| 1275.0 | 17.672 |
| 1274.0 | 17.126 |
| 1273.0 | 16.322 |
| 1272.0 | 15.273 |
| 1271.0 | 13.975 |
| 1270.0 | 12.442 |
| 1269.0 | 10.847 |
| 1268.0 | 9.287 |
| 1267.0 | 7.798 |
| 1266.0 | 6.458 |
| 1265.0 | 5.321 |
| 1264.0 | 4.307 |
| 1263.0 | 3.486 |
| 1262.0 | 2.848 |
| 1261.0 | 2.315 |
| 1260.0 | 1.89 |
| 1259.0 | 1.546 |
| 1258.0 | 1.273 |
| 1257.0 | 1.044 |
| 1256.0 | 0.865 |
| 1255.0 | 0.725 |
| 1254.0 | 0.608 |
| 1253.0 | 0.516 |
| 1252.0 | 0.437 |
| 1251.0 | 0.372 |
| 1250.0 | 0.318 |
| 1249.0 | 0.275 |
| 1248.0 | 0.237 |
| 1247.0 | 0.205 |
| 1246.0 | 0.182 |
| 1245.0 | 0.157 |
| 1244.0 | 0.139 |
| 1243.0 | 0.125 |
| 1242.0 | 0.109 |
| 1241.0 | 0.099 |
| 1240.0 | 0.092 |
| 1239.0 | 0.082 |
| 1238.0 | 0.072 |
| 1237.0 | 0.066 |
| 1236.0 | 0.06 |
| 1235.0 | 0.056 |
| 1234.0 | 0.053 |
| 1233.0 | 0.052 |
| 1232.0 | 0.045 |
| 1231.0 | 0.038 |
| 1230.0 | 0.039 |
| 1229.0 | 0.037 |
| 1228.0 | 0.035 |
| 1227.0 | 0.032 |
| 1226.0 | 0.032 |
| 1225.0 | 0.027 |
| 1224.0 | 0.028 |
| 1223.0 | 0.027 |
| 1222.0 | 0.025 |
| 1221.0 | 0.024 |
| 1220.0 | 0.024 |
| 1219.0 | 0.023 |
| 1218.0 | 0.021 |
| 1217.0 | 0.022 |
| 1216.0 | 0.022 |
| 1215.0 | 0.022 |
| 1214.0 | 0.019 |
| 1213.0 | 0.022 |
| 1212.0 | 0.02 |
| 1211.0 | 0.02 |
| 1210.0 | 0.019 |
| 1209.0 | 0.017 |
| 1208.0 | 0.019 |
| 1207.0 | 0.02 |
| 1206.0 | 0.016 |
| 1205.0 | 0.018 |
| 1204.0 | 0.016 |
| 1203.0 | 0.019 |
| 1202.0 | 0.016 |
| 1201.0 | 0.018 |
| 1200.0 | 0.016 |
| 1199.0 | 0.022 |
| 1198.0 | 0.021 |
| 1197.0 | 0.017 |
| 1196.0 | 0.019 |
| 1195.0 | 0.016 |
| 1194.0 | 0.018 |
| 1193.0 | 0.017 |
| 1192.0 | 0.019 |
| 1191.0 | 0.015 |
| 1190.0 | 0.017 |
| 1189.0 | 0.016 |
| 1188.0 | 0.018 |
| 1187.0 | 0.014 |
| 1186.0 | 0.018 |
| 1185.0 | 0.017 |
| 1184.0 | 0.016 |
| 1183.0 | 0.014 |
| 1182.0 | 0.015 |
| 1181.0 | 0.015 |
| 1180.0 | 0.014 |
| 1179.0 | 0.015 |
| 1178.0 | 0.016 |
| 1177.0 | 0.016 |
| 1176.0 | 0.014 |
| 1175.0 | 0.013 |
| 1174.0 | 0.013 |
| 1173.0 | 0.014 |
| 1172.0 | 0.016 |
| 1171.0 | 0.013 |
| 1170.0 | 0.015 |
| 1169.0 | 0.015 |
| 1168.0 | 0.017 |
| 1167.0 | 0.015 |
| 1166.0 | 0.016 |
| 1165.0 | 0.013 |
| 1164.0 | 0.015 |
| 1163.0 | 0.015 |
| 1162.0 | 0.018 |
| 1161.0 | 0.015 |
| 1160.0 | 0.015 |
| 1159.0 | 0.015 |
| 1158.0 | 0.014 |
| 1157.0 | 0.018 |
| 1156.0 | 0.015 |
| 1155.0 | 0.014 |
| 1154.0 | 0.015 |
| 1153.0 | 0.014 |
| 1152.0 | 0.016 |
| 1151.0 | 0.015 |
| 1150.0 | 0.014 |
| 1149.0 | 0.015 |
| 1148.0 | 0.014 |
| 1147.0 | 0.015 |
| 1146.0 | 0.014 |
| 1145.0 | 0.014 |
| 1144.0 | 0.014 |
| 1143.0 | 0.013 |
| 1142.0 | 0.015 |
| 1141.0 | 0.015 |
| 1140.0 | 0.014 |
| 1139.0 | 0.016 |
| 1138.0 | 0.016 |
| 1137.0 | 0.016 |
| 1136.0 | 0.016 |
| 1135.0 | 0.018 |
| 1134.0 | 0.012 |
| 1133.0 | 0.015 |
| 1132.0 | 0.016 |
| 1131.0 | 0.013 |
| 1130.0 | 0.016 |
| 1129.0 | 0.016 |
| 1128.0 | 0.015 |
| 1127.0 | 0.016 |
| 1126.0 | 0.014 |
| 1125.0 | 0.017 |
| 1124.0 | 0.016 |
| 1123.0 | 0.015 |
| 1122.0 | 0.014 |
| 1121.0 | 0.015 |
| 1120.0 | 0.015 |
| 1119.0 | 0.014 |
| 1118.0 | 0.014 |
| 1117.0 | 0.014 |
| 1116.0 | 0.017 |
| 1115.0 | 0.016 |
| 1114.0 | 0.014 |
| 1113.0 | 0.014 |
| 1112.0 | 0.017 |
| 1111.0 | 0.015 |
| 1110.0 | 0.014 |
| 1109.0 | 0.017 |
| 1108.0 | 0.015 |
| 1107.0 | 0.015 |
| 1106.0 | 0.015 |
| 1105.0 | 0.015 |
| 1104.0 | 0.017 |
| 1103.0 | 0.015 |
| 1102.0 | 0.016 |
| 1101.0 | 0.015 |
| 1100.0 | 0.016 |
| 1099.0 | 0.015 |
| 1098.0 | 0.013 |
| 1097.0 | 0.018 |
| 1096.0 | 0.015 |
| 1095.0 | 0.015 |
| 1094.0 | 0.015 |
| 1093.0 | 0.016 |
| 1092.0 | 0.014 |
| 1091.0 | 0.014 |
| 1090.0 | 0.017 |
| 1089.0 | 0.013 |
| 1088.0 | 0.016 |
| 1087.0 | 0.015 |
| 1086.0 | 0.016 |
| 1085.0 | 0.018 |
| 1084.0 | 0.013 |
| 1083.0 | 0.014 |
| 1082.0 | 0.014 |
| 1081.0 | 0.014 |
| 1080.0 | 0.015 |
| 1079.0 | 0.015 |
| 1078.0 | 0.013 |
| 1077.0 | 0.015 |
| 1076.0 | 0.016 |
| 1075.0 | 0.015 |
| 1074.0 | 0.015 |
| 1073.0 | 0.014 |
| 1072.0 | 0.016 |
| 1071.0 | 0.018 |
| 1070.0 | 0.016 |
| 1069.0 | 0.014 |
| 1068.0 | 0.017 |
| 1067.0 | 0.015 |
| 1066.0 | 0.015 |
| 1065.0 | 0.013 |
| 1064.0 | 0.014 |
| 1063.0 | 0.016 |
| 1062.0 | 0.016 |
| 1061.0 | 0.016 |
| 1060.0 | 0.015 |
| 1059.0 | 0.013 |
| 1058.0 | 0.017 |
| 1057.0 | 0.014 |
| 1056.0 | 0.015 |
| 1055.0 | 0.017 |
| 1054.0 | 0.019 |
| 1053.0 | 0.014 |
| 1052.0 | 0.015 |
| 1051.0 | 0.017 |
| 1050.0 | 0.016 |
| 1049.0 | 0.015 |
| 1048.0 | 0.015 |
| 1047.0 | 0.018 |
| 1046.0 | 0.013 |
| 1045.0 | 0.016 |
| 1044.0 | 0.013 |
| 1043.0 | 0.015 |
| 1042.0 | 0.014 |
| 1041.0 | 0.014 |
| 1040.0 | 0.016 |
| 1039.0 | 0.015 |
| 1038.0 | 0.014 |
| 1037.0 | 0.016 |
| 1036.0 | 0.016 |
| 1035.0 | 0.015 |
| 1034.0 | 0.017 |
| 1033.0 | 0.015 |
| 1032.0 | 0.016 |
| 1031.0 | 0.017 |
| 1030.0 | 0.018 |
| 1029.0 | 0.016 |
| 1028.0 | 0.015 |
| 1027.0 | 0.014 |
| 1026.0 | 0.015 |
| 1025.0 | 0.015 |
| 1024.0 | 0.015 |
| 1023.0 | 0.015 |
| 1022.0 | 0.016 |
| 1021.0 | 0.015 |
| 1020.0 | 0.016 |
| 1019.0 | 0.014 |
| 1018.0 | 0.013 |
| 1017.0 | 0.014 |
| 1016.0 | 0.014 |
| 1015.0 | 0.015 |
| 1014.0 | 0.016 |
| 1013.0 | 0.013 |
| 1012.0 | 0.018 |
| 1011.0 | 0.016 |
| 1010.0 | 0.017 |
| 1009.0 | 0.014 |
| 1008.0 | 0.016 |
| 1007.0 | 0.014 |
| 1006.0 | 0.016 |
| 1005.0 | 0.016 |
| 1004.0 | 0.015 |
| 1003.0 | 0.015 |
| 1002.0 | 0.016 |
| 1001.0 | 0.016 |
| 1000.0 | 0.015 |
| 999.0 | 0.015 |
| 998.0 | 0.016 |
| 997.0 | 0.015 |
| 996.0 | 0.017 |
| 995.0 | 0.014 |
| 994.0 | 0.016 |
| 993.0 | 0.015 |
| 992.0 | 0.016 |
| 991.0 | 0.018 |
| 990.0 | 0.014 |
| 989.0 | 0.016 |
| 988.0 | 0.012 |
| 987.0 | 0.016 |
| 986.0 | 0.016 |
| 985.0 | 0.013 |
| 984.0 | 0.011 |
| 983.0 | 0.015 |
| 982.0 | 0.013 |
| 981.0 | 0.014 |
| 980.0 | 0.015 |
| 979.0 | 0.016 |
| 978.0 | 0.016 |
| 977.0 | 0.014 |
| 976.0 | 0.015 |
| 975.0 | 0.017 |
| 974.0 | 0.014 |
| 973.0 | 0.018 |
| 972.0 | 0.015 |
| 971.0 | 0.016 |
| 970.0 | 0.018 |
| 969.0 | 0.015 |
| 968.0 | 0.015 |
| 967.0 | 0.017 |
| 966.0 | 0.014 |
| 965.0 | 0.015 |
| 964.0 | 0.015 |
| 963.0 | 0.015 |
| 962.0 | 0.016 |
| 961.0 | 0.015 |
| 960.0 | 0.015 |
| 959.0 | 0.017 |
| 958.0 | 0.013 |
| 957.0 | 0.013 |
| 956.0 | 0.015 |
| 955.0 | 0.016 |
| 954.0 | 0.015 |
| 953.0 | 0.016 |
| 952.0 | 0.016 |
| 951.0 | 0.016 |
| 950.0 | 0.016 |
| 949.0 | 0.014 |
| 948.0 | 0.013 |
| 947.0 | 0.016 |
| 946.0 | 0.016 |
| 945.0 | 0.014 |
| 944.0 | 0.015 |
| 943.0 | 0.015 |
| 942.0 | 0.017 |
| 941.0 | 0.016 |
| 940.0 | 0.014 |
| 939.0 | 0.014 |
| 938.0 | 0.016 |
| 937.0 | 0.015 |
| 936.0 | 0.015 |
| 935.0 | 0.017 |
| 934.0 | 0.015 |
| 933.0 | 0.014 |
| 932.0 | 0.016 |
| 931.0 | 0.016 |
| 930.0 | 0.019 |
| 929.0 | 0.015 |
| 928.0 | 0.015 |
| 927.0 | 0.015 |
| 926.0 | 0.015 |
| 925.0 | 0.014 |
| 924.0 | 0.014 |
| 923.0 | 0.015 |
| 922.0 | 0.017 |
| 921.0 | 0.012 |
| 920.0 | 0.016 |
| 919.0 | 0.014 |
| 918.0 | 0.016 |
| 917.0 | 0.016 |
| 916.0 | 0.019 |
| 915.0 | 0.015 |
| 914.0 | 0.016 |
| 913.0 | 0.017 |
| 912.0 | 0.013 |
| 911.0 | 0.015 |
| 910.0 | 0.014 |
| 909.0 | 0.015 |
| 908.0 | 0.016 |
| 907.0 | 0.017 |
| 906.0 | 0.015 |
| 905.0 | 0.016 |
| 904.0 | 0.016 |
| 903.0 | 0.013 |
| 902.0 | 0.014 |
| 901.0 | 0.016 |
| 900.0 | 0.015 |
| 899.0 | 0.013 |
| 898.0 | 0.017 |
| 897.0 | 0.017 |
| 896.0 | 0.016 |
| 895.0 | 0.019 |
| 894.0 | 0.015 |
| 893.0 | 0.016 |
| 892.0 | 0.016 |
| 891.0 | 0.015 |
| 890.0 | 0.015 |
| 889.0 | 0.017 |
| 888.0 | 0.015 |
| 887.0 | 0.015 |
| 886.0 | 0.016 |
| 885.0 | 0.016 |
| 884.0 | 0.015 |
| 883.0 | 0.013 |
| 882.0 | 0.013 |
| 881.0 | 0.015 |
| 880.0 | 0.017 |
| 879.0 | 0.018 |
| 878.0 | 0.016 |
| 877.0 | 0.015 |
| 876.0 | 0.014 |
| 875.0 | 0.016 |
| 874.0 | 0.017 |
| 873.0 | 0.015 |
| 872.0 | 0.013 |
| 871.0 | 0.013 |
| 870.0 | 0.017 |
| 869.0 | 0.016 |
| 868.0 | 0.015 |
| 867.0 | 0.013 |
| 866.0 | 0.015 |
| 865.0 | 0.014 |
| 864.0 | 0.013 |
| 863.0 | 0.016 |
| 862.0 | 0.017 |
| 861.0 | 0.016 |
| 860.0 | 0.015 |
| 859.0 | 0.014 |
| 858.0 | 0.014 |
| 857.0 | 0.017 |
| 856.0 | 0.016 |
| 855.0 | 0.015 |
| 854.0 | 0.016 |
| 853.0 | 0.018 |
| 852.0 | 0.015 |
| 851.0 | 0.014 |
| 850.0 | 0.015 |
| 849.0 | 0.017 |
| 848.0 | 0.016 |
| 847.0 | 0.016 |
| 846.0 | 0.015 |
| 845.0 | 0.012 |
| 844.0 | 0.014 |
| 843.0 | 0.018 |
| 842.0 | 0.016 |
| 841.0 | 0.015 |
| 840.0 | 0.015 |
| 839.0 | 0.017 |
| 838.0 | 0.015 |
| 837.0 | 0.012 |
| 836.0 | 0.014 |
| 835.0 | 0.016 |
| 834.0 | 0.014 |
| 833.0 | 0.014 |
| 832.0 | 0.015 |
| 831.0 | 0.016 |
| 830.0 | 0.018 |
| 829.0 | 0.016 |
| 828.0 | 0.017 |
| 827.0 | 0.016 |
| 826.0 | 0.016 |
| 825.0 | 0.016 |
| 824.0 | 0.014 |
| 823.0 | 0.015 |
| 822.0 | 0.016 |
| 821.0 | 0.013 |
| 820.0 | 0.014 |
| 819.0 | 0.015 |
| 818.0 | 0.015 |
| 817.0 | 0.014 |
| 816.0 | 0.013 |
| 815.0 | 0.014 |
| 814.0 | 0.015 |
| 813.0 | 0.017 |
| 812.0 | 0.016 |
| 811.0 | 0.016 |
| 810.0 | 0.017 |
| 809.0 | 0.014 |
| 808.0 | 0.015 |
| 807.0 | 0.016 |
| 806.0 | 0.013 |
| 805.0 | 0.014 |
| 804.0 | 0.012 |
| 803.0 | 0.015 |
| 802.0 | 0.014 |
| 801.0 | 0.015 |
| 800.0 | 0.015 |
| 799.0 | 0 |
| 798.0 | 0 |
| 797.0 | 0 |
| 796.0 | 0 |
| 795.0 | 0 |
| 794.0 | 0 |
| 793.0 | 0 |
| 792.0 | 0 |
| 791.0 | 0 |
| 790.0 | 0 |
| 789.0 | 0 |
| 788.0 | 0 |
| 787.0 | 0 |
| 786.0 | 0 |
| 785.0 | 0 |
| 784.0 | 0 |
| 783.0 | 0 |
| 782.0 | 0 |
| 781.0 | 0 |
| 780.0 | 0 |
| 779.0 | 0 |
| 778.0 | 0 |
| 777.0 | 0 |
| 776.0 | 0 |
| 775.0 | 0 |
| 774.0 | 0 |
| 773.0 | 0 |
| 772.0 | 0 |
| 771.0 | 0 |
| 770.0 | 0 |
| 769.0 | 0 |
| 768.0 | 0 |
| 767.0 | 0 |
| 766.0 | 0 |
| 765.0 | 0 |
| 764.0 | 0 |
| 763.0 | 0 |
| 762.0 | 0 |
| 761.0 | 0 |
| 760.0 | 0 |
| 759.0 | 0 |
| 758.0 | 0 |
| 757.0 | 0 |
| 756.0 | 0 |
| 755.0 | 0 |
| 754.0 | 0 |
| 753.0 | 0 |
| 752.0 | 0 |
| 751.0 | 0 |
| 750.0 | 0 |
| 749.0 | 0 |
| 748.0 | 0 |
| 747.0 | 0 |
| 746.0 | 0 |
| 745.0 | 0 |
| 744.0 | 0 |
| 743.0 | 0 |
| 742.0 | 0 |
| 741.0 | 0 |
| 740.0 | 0 |
| 739.0 | 0 |
| 738.0 | 0 |
| 737.0 | 0 |
| 736.0 | 0 |
| 735.0 | 0 |
| 734.0 | 0 |
| 733.0 | 0 |
| 732.0 | 0 |
| 731.0 | 0 |
| 730.0 | 0 |
| 729.0 | 0 |
| 728.0 | 0 |
| 727.0 | 0 |
| 726.0 | 0 |
| 725.0 | 0 |
| 724.0 | 0 |
| 723.0 | 0 |
| 722.0 | 0 |
| 721.0 | 0 |
| 720.0 | 0 |
| 719.0 | 0 |
| 718.0 | 0 |
| 717.0 | 0.001 |
| 716.0 | 0 |
| 715.0 | 0 |
| 714.0 | 0.001 |
| 713.0 | 0.001 |
| 712.0 | 0.001 |
| 711.0 | 0.001 |
| 710.0 | 0.001 |
| 709.0 | 0.001 |
| 708.0 | 0.001 |
| 707.0 | 0.001 |
| 706.0 | 0.001 |
| 705.0 | 0 |
| 704.0 | 0.001 |
| 703.0 | 0.001 |
| 702.0 | 0.001 |
| 701.0 | 0 |
| 700.0 | 0.001 |
| 699.0 | 0 |
| 698.0 | 0.001 |
| 697.0 | 0 |
| 696.0 | 0 |
| 695.0 | 0 |
| 694.0 | 0.001 |
| 693.0 | 0 |
| 692.0 | 0.001 |
| 691.0 | 0.001 |
| 690.0 | 0 |
| 689.0 | 0 |
| 688.0 | 0 |
| 687.0 | 0 |
| 686.0 | 0 |
| 685.0 | 0.001 |
| 684.0 | 0 |
| 683.0 | 0 |
| 682.0 | 0 |
| 681.0 | 0 |
| 680.0 | 0 |
| 679.0 | 0 |
| 678.0 | 0 |
| 677.0 | 0 |
| 676.0 | 0 |
| 675.0 | 0.001 |
| 674.0 | 0 |
| 673.0 | 0.001 |
| 672.0 | 0 |
| 671.0 | 0.001 |
| 670.0 | 0.001 |
| 669.0 | 0.001 |
| 668.0 | 0.001 |
| 667.0 | 0.001 |
| 666.0 | 0.001 |
| 665.0 | 0.001 |
| 664.0 | 0.001 |
| 663.0 | 0.001 |
| 662.0 | 0.001 |
| 661.0 | 0.001 |
| 660.0 | 0.001 |
| 659.0 | 0.001 |
| 658.0 | 0.001 |
| 657.0 | 0.001 |
| 656.0 | 0.002 |
| 655.0 | 0.002 |
| 654.0 | 0.002 |
| 653.0 | 0.003 |
| 652.0 | 0.003 |
| 651.0 | 0.004 |
| 650.0 | 0.005 |
| 649.0 | 0.006 |
| 648.0 | 0.007 |
| 647.0 | 0.009 |
| 646.0 | 0.012 |
| 645.0 | 0.016 |
| 644.0 | 0.022 |
| 643.0 | 0.032 |
| 642.0 | 0.048 |
| 641.0 | 0.076 |
| 640.0 | 0.131 |
| 639.0 | 0.251 |
| 638.0 | 0.558 |
| 637.0 | 1.554 |
| 636.0 | 5.867 |
| 635.0 | 20.085 |
| 634.0 | 43.088 |
| 633.0 | 54.067 |
| 632.0 | 40.005 |
| 631.0 | 17.478 |
| 630.0 | 4.854 |
| 629.0 | 1.282 |
| 628.0 | 0.453 |
| 627.0 | 0.201 |
| 626.0 | 0.103 |
| 625.0 | 0.058 |
| 624.0 | 0.036 |
| 623.0 | 0.023 |
| 622.0 | 0.016 |
| 621.0 | 0.011 |
| 620.0 | 0.008 |
| 619.0 | 0.006 |
| 618.0 | 0.004 |
| 617.0 | 0.004 |
| 616.0 | 0.003 |
| 615.0 | 0.002 |
| 614.0 | 0.002 |
| 613.0 | 0.001 |
| 612.0 | 0.001 |
| 611.0 | 0.001 |
| 610.0 | 0.001 |
| 609.0 | 0.001 |
| 608.0 | 0.001 |
| 607.0 | 0.001 |
| 606.0 | 0 |
| 605.0 | 0.001 |
| 604.0 | 0 |
| 603.0 | 0 |
| 602.0 | 0 |
| 601.0 | 0 |
| 600.0 | 0 |
| 599.0 | 0 |
| 598.0 | 0 |
| 597.0 | 0 |
| 596.0 | 0 |
| 595.0 | 0 |
| 594.0 | 0 |
| 593.0 | 0 |
| 592.0 | 0 |
| 591.0 | 0 |
| 590.0 | 0 |
| 589.0 | 0 |
| 588.0 | 0 |
| 587.0 | 0 |
| 586.0 | 0 |
| 585.0 | 0 |
| 584.0 | 0 |
| 583.0 | 0 |
| 582.0 | 0 |
| 581.0 | 0 |
| 580.0 | 0 |
| 579.0 | 0 |
| 578.0 | 0 |
| 577.0 | 0 |
| 576.0 | 0 |
| 575.0 | 0 |
| 574.0 | 0 |
| 573.0 | 0 |
| 572.0 | 0 |
| 571.0 | 0 |
| 570.0 | 0 |
| 569.0 | 0 |
| 568.0 | 0 |
| 567.0 | 0 |
| 566.0 | 0 |
| 565.0 | 0 |
| 564.0 | 0 |
| 563.0 | 0 |
| 562.0 | 0 |
| 561.0 | 0 |
| 560.0 | 0 |
| 559.0 | 0 |
| 558.0 | 0 |
| 557.0 | 0 |
| 556.0 | 0 |
| 555.0 | 0 |
| 554.0 | 0 |
| 553.0 | 0 |
| 552.0 | 0 |
| 551.0 | 0 |
| 550.0 | 0 |
| 549.0 | 0 |
| 548.0 | 0 |
| 547.0 | 0 |
| 546.0 | 0 |
| 545.0 | 0 |
| 544.0 | 0 |
| 543.0 | 0 |
| 542.0 | 0 |
| 541.0 | 0 |
| 540.0 | 0 |
| 539.0 | 0 |
| 538.0 | 0 |
| 537.0 | 0 |
| 536.0 | 0 |
| 535.0 | 0 |
| 534.0 | 0 |
| 533.0 | 0 |
| 532.0 | 0 |
| 531.0 | 0 |
| 530.0 | 0 |
| 529.0 | 0 |
| 528.0 | 0 |
| 527.0 | 0 |
| 526.0 | 0 |
| 525.0 | 0 |
| 524.0 | 0 |
| 523.0 | 0 |
| 522.0 | 0 |
| 521.0 | 0 |
| 520.0 | 0 |
| 519.0 | 0 |
| 518.0 | 0 |
| 517.0 | 0 |
| 516.0 | 0 |
| 515.0 | 0 |
| 514.0 | 0 |
| 513.0 | 0 |
| 512.0 | 0 |
| 511.0 | 0 |
| 510.0 | 0 |
| 509.0 | 0 |
| 508.0 | 0 |
| 507.0 | 0 |
| 506.0 | 0 |
| 505.0 | 0 |
| 504.0 | 0 |
| 503.0 | 0 |
| 502.0 | 0 |
| 501.0 | 0 |
| 500.0 | 0 |
| 499.0 | 0 |
| 498.0 | 0 |
| 497.0 | 0 |
| 496.0 | 0 |
| 495.0 | 0 |
| 494.0 | 0 |
| 493.0 | 0 |
| 492.0 | 0 |
| 491.0 | 0 |
| 490.0 | 0 |
| 489.0 | 0 |
| 488.0 | 0 |
| 487.0 | 0 |
| 486.0 | 0 |
| 485.0 | 0 |
| 484.0 | 0 |
| 483.0 | 0 |
| 482.0 | 0 |
| 481.0 | 0 |
| 480.0 | 0 |
| 479.0 | 0 |
| 478.0 | 0 |
| 477.0 | 0 |
| 476.0 | 0 |
| 475.0 | 0 |
| 474.0 | 0 |
| 473.0 | 0 |
| 472.0 | 0 |
| 471.0 | 0 |
| 470.0 | 0 |
| 469.0 | 0 |
| 468.0 | 0 |
| 467.0 | 0 |
| 466.0 | 0 |
| 465.0 | 0 |
| 464.0 | 0 |
| 463.0 | 0 |
| 462.0 | 0 |
| 461.0 | 0 |
| 460.0 | 0 |
| 459.0 | 0 |
| 458.0 | 0 |
| 457.0 | 0 |
| 456.0 | 0 |
| 455.0 | 0 |
| 454.0 | 0 |
| 453.0 | 0 |
| 452.0 | 0 |
| 451.0 | 0 |
| 450.0 | 0 |
| 449.0 | 0 |
| 448.0 | 0 |
| 447.0 | 0 |
| 446.0 | 0 |
| 445.0 | 0 |
| 444.0 | 0 |
| 443.0 | 0 |
| 442.0 | 0 |
| 441.0 | 0 |
| 440.0 | 0 |
| 439.0 | 0 |
| 438.0 | 0 |
| 437.0 | 0 |
| 436.0 | 0 |
| 435.0 | 0 |
| 434.0 | 0 |
| 433.0 | 0 |
| 432.0 | 0 |
| 431.0 | 0 |
| 430.0 | 0 |
| 429.0 | 0 |
| 428.0 | 0 |
| 427.0 | 0 |
| 426.0 | 0 |
| 425.0 | 0 |
| 424.0 | 0 |
| 423.0 | 0 |
| 422.0 | 0 |
| 421.0 | 0 |
| 420.0 | 0 |
| 419.0 | 0 |
| 418.0 | 0 |
| 417.0 | 0 |
| 416.0 | 0 |
| 415.0 | 0 |
| 414.0 | 0 |
| 413.0 | 0 |
| 412.0 | 0 |
| 411.0 | 0 |
| 410.0 | 0 |
| 409.0 | 0 |
| 408.0 | 0 |
| 407.0 | 0 |
| 406.0 | 0 |
| 405.0 | 0 |
| 404.0 | 0 |
| 403.0 | 0 |
| 402.0 | 0 |
| 401.0 | 0 |
| 400.0 | 0 |
| 399.0 | 0 |
| 398.0 | 0 |
| 397.0 | 0 |
| 396.0 | 0 |
| 395.0 | 0 |
| 394.0 | 0 |
| 393.0 | 0 |
| 392.0 | 0 |
| 391.0 | 0 |
| 390.0 | 0 |
| 389.0 | 0 |
| 388.0 | 0 |
| 387.0 | 0 |
| 386.0 | 0 |
| 385.0 | 0 |
| 384.0 | 0 |
| 383.0 | 0 |
| 382.0 | 0 |
| 381.0 | 0 |
| 380.0 | 0 |
| 379.0 | 0 |
| 378.0 | 0 |
| 377.0 | 0 |
| 376.0 | 0 |
| 375.0 | 0 |
| 374.0 | 0 |
| 373.0 | 0 |
| 372.0 | 0 |
| 371.0 | 0 |
| 370.0 | 0 |
| 369.0 | 0 |
| 368.0 | 0 |
| 367.0 | 0 |
| 366.0 | 0 |
| 365.0 | 0 |
| 364.0 | 0 |
| 363.0 | 0 |
| 362.0 | 0 |
| 361.0 | 0 |
| 360.0 | 0 |
| 359.0 | 0 |
| 358.0 | 0 |
| 357.0 | 0 |
| 356.0 | 0 |
| 355.0 | 0 |
| 354.0 | 0 |
| 353.0 | 0 |
| 352.0 | 0 |
| 351.0 | 0 |
| 350.0 | 0 |
| 349.0 | 0.001 |
| 348.0 | 0 |
| 347.0 | 0 |
| 346.0 | 0 |
| 345.0 | 0 |
| 344.0 | 0 |
| 343.0 | 0 |
| 342.0 | 0 |
| 341.0 | 0 |
| 340.0 | 0 |
| 339.0 | 0 |
| 338.0 | 0 |
| 337.0 | 0 |
| 336.0 | 0 |
| 335.0 | 0 |
| 334.0 | 0 |
| 333.0 | 0 |
| 332.0 | 0 |
| 331.0 | 0 |
| 330.0 | 0 |
| 329.0 | 0 |
| 328.0 | 0 |
| 327.0 | 0 |
| 326.0 | 0 |
| 325.0 | 0 |
| 324.0 | 0 |
| 323.0 | 0 |
| 322.0 | 0 |
| 321.0 | 0 |
| 320.0 | 0 |
| 319.0 | 0 |
| 318.0 | 0 |
| 317.0 | 0 |
| 316.0 | 0 |
| 315.0 | 0 |
| 314.0 | 0 |
| 313.0 | 0 |
| 312.0 | 0 |
| 311.0 | 0 |
| 310.0 | 0 |
| 309.0 | 0 |
| 308.0 | 0 |
| 307.0 | 0 |
| 306.0 | 0 |
| 305.0 | 0 |
| 304.0 | 0 |
| 303.0 | 0 |
| 302.0 | 0 |
| 301.0 | 0 |
| 300.0 | 0 |
| 299.0 | 0 |
| 298.0 | 0 |
| 297.0 | 0 |
| 296.0 | 0 |
| 295.0 | 0 |
| 294.0 | 0 |
| 293.0 | 0 |
| 292.0 | 0 |
| 291.0 | 0 |
| 290.0 | 0 |
| 289.0 | 0 |
| 288.0 | 0 |
| 287.0 | 0 |
| 286.0 | 0 |
| 285.0 | 0 |
| 284.0 | 0 |
| 283.0 | 0 |
| 282.0 | 0 |
| 281.0 | 0 |
| 280.0 | 0 |
| 279.0 | 0 |
| 278.0 | 0 |
| 277.0 | 0 |
| 276.0 | 0 |
| 275.0 | 0 |
| 274.0 | 0 |
| 273.0 | 0 |
| 272.0 | 0 |
| 271.0 | 0 |
| 270.0 | 0 |
| 269.0 | 0 |
| 268.0 | 0 |
| 267.0 | 0 |
| 266.0 | 0 |
| 265.0 | 0 |
| 264.0 | 0 |
| 263.0 | 0 |
| 262.0 | 0 |
| 261.0 | 0 |
| 260.0 | 0 |
| 259.0 | 0 |
| 258.0 | 0 |
| 257.0 | 0 |
| 256.0 | 0 |
| 255.0 | 0 |
| 254.0 | 0 |
| 253.0 | 0 |
| 252.0 | 0 |
| 251.0 | 0 |
| 250.0 | 0 |
| 249.0 | 0 |
| 248.0 | 0 |
| 247.0 | 0 |
| 246.0 | 0 |
| 245.0 | 0 |
| 244.0 | 0 |
| 243.0 | 0 |
| 242.0 | 0 |
| 241.0 | 0 |
| 240.0 | 0 |
| 239.0 | 0 |
| 238.0 | 0 |
| 237.0 | 0 |
| 236.0 | 0 |
| 235.0 | 0 |
| 234.0 | 0 |
| 233.0 | 0 |
| 232.0 | 0 |
| 231.0 | 0 |
| 230.0 | 0 |
| 229.0 | 0 |
| 228.0 | 0 |
| 227.0 | 0 |
| 226.0 | 0 |
| 225.0 | 0 |
| 224.0 | 0 |
| 223.0 | 0 |
| 222.0 | 0 |
| 221.0 | 0 |
| 220.0 | 0 |
| 219.0 | 0 |
| 218.0 | 0 |
| 217.0 | 0 |
| 216.0 | 0 |
| 215.0 | 0 |
| 214.0 | 0 |
| 213.0 | 0 |
| 212.0 | 0 |
| 211.0 | 0 |
| 210.0 | 0 |
| 209.0 | 0 |
| 208.0 | 0 |
| 207.0 | 0 |
| 206.0 | 0 |
| 205.0 | 0 |
| 204.0 | 0 |
| 203.0 | 0 |
| 202.0 | 0 |
| 201.0 | 0 |